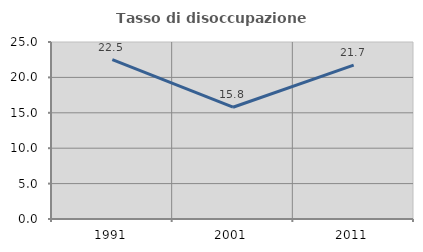
| Category | Tasso di disoccupazione giovanile  |
|---|---|
| 1991.0 | 22.5 |
| 2001.0 | 15.789 |
| 2011.0 | 21.739 |